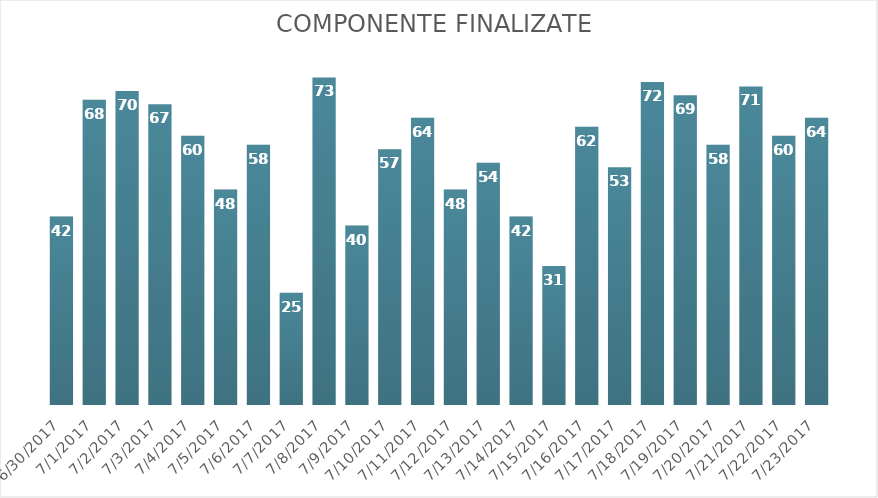
| Category | Componente 
finalizate |
|---|---|
| 6/30/17 | 42 |
| 7/1/17 | 68 |
| 7/2/17 | 70 |
| 7/3/17 | 67 |
| 7/4/17 | 60 |
| 7/5/17 | 48 |
| 7/6/17 | 58 |
| 7/7/17 | 25 |
| 7/8/17 | 73 |
| 7/9/17 | 40 |
| 7/10/17 | 57 |
| 7/11/17 | 64 |
| 7/12/17 | 48 |
| 7/13/17 | 54 |
| 7/14/17 | 42 |
| 7/15/17 | 31 |
| 7/16/17 | 62 |
| 7/17/17 | 53 |
| 7/18/17 | 72 |
| 7/19/17 | 69 |
| 7/20/17 | 58 |
| 7/21/17 | 71 |
| 7/22/17 | 60 |
| 7/23/17 | 64 |